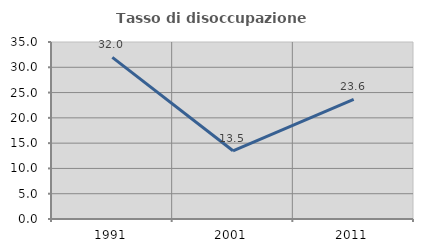
| Category | Tasso di disoccupazione giovanile  |
|---|---|
| 1991.0 | 31.955 |
| 2001.0 | 13.488 |
| 2011.0 | 23.634 |